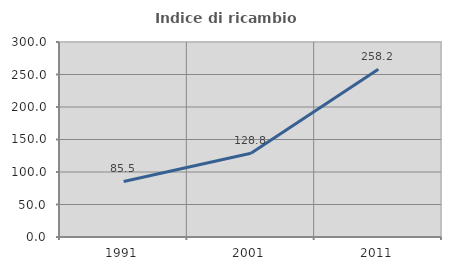
| Category | Indice di ricambio occupazionale  |
|---|---|
| 1991.0 | 85.495 |
| 2001.0 | 128.834 |
| 2011.0 | 258.221 |